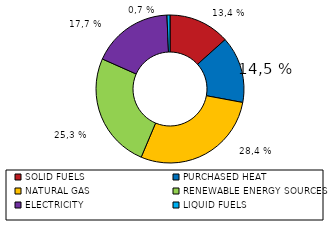
| Category | Series 0 |
|---|---|
| SOLID FUELS | 39145 |
| PURCHASED HEAT | 42545 |
| NATURAL GAS | 83243 |
| RENEWABLE ENERGY SOURCES | 73977 |
| ELECTRICITY | 51775 |
| LIQUID FUELS | 1919 |